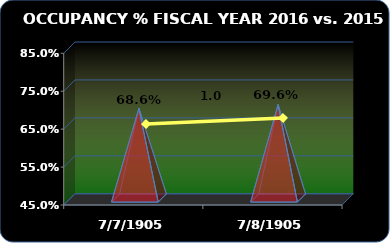
| Category | Occupancy % |
|---|---|
| 2016.0 | 0.696 |
| 2015.0 | 0.686 |